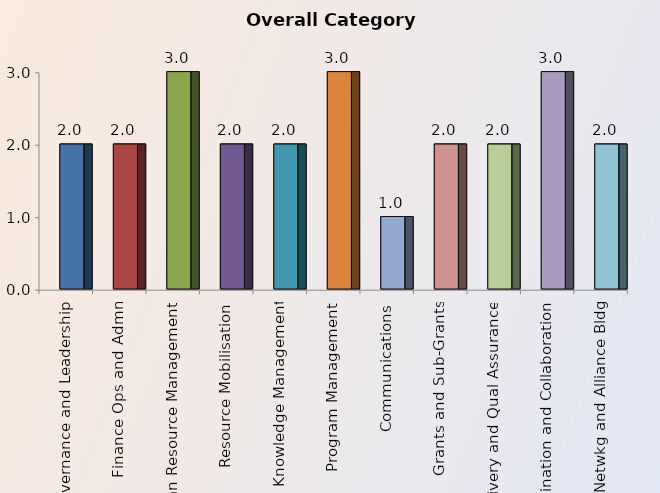
| Category | Overall Category Score |
|---|---|
| Governance and Leadership | 2 |
| Finance Ops and Admn | 2 |
| Human Resource Management | 3 |
| Resource Mobilisation | 2 |
| M&E and Knowledge Management | 2 |
| Program Management | 3 |
| Communications | 1 |
| Grants and Sub-Grants | 2 |
| Service Delivery and Qual Assurance | 2 |
| Coordination and Collaboration | 3 |
| Advocacy Netwkg and Alliance Bldg | 2 |